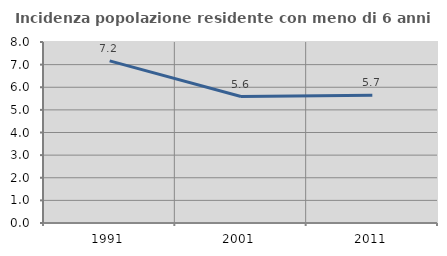
| Category | Incidenza popolazione residente con meno di 6 anni |
|---|---|
| 1991.0 | 7.167 |
| 2001.0 | 5.591 |
| 2011.0 | 5.651 |